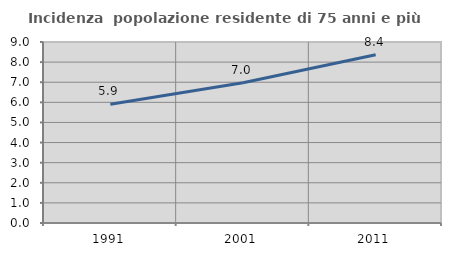
| Category | Incidenza  popolazione residente di 75 anni e più |
|---|---|
| 1991.0 | 5.9 |
| 2001.0 | 6.973 |
| 2011.0 | 8.37 |